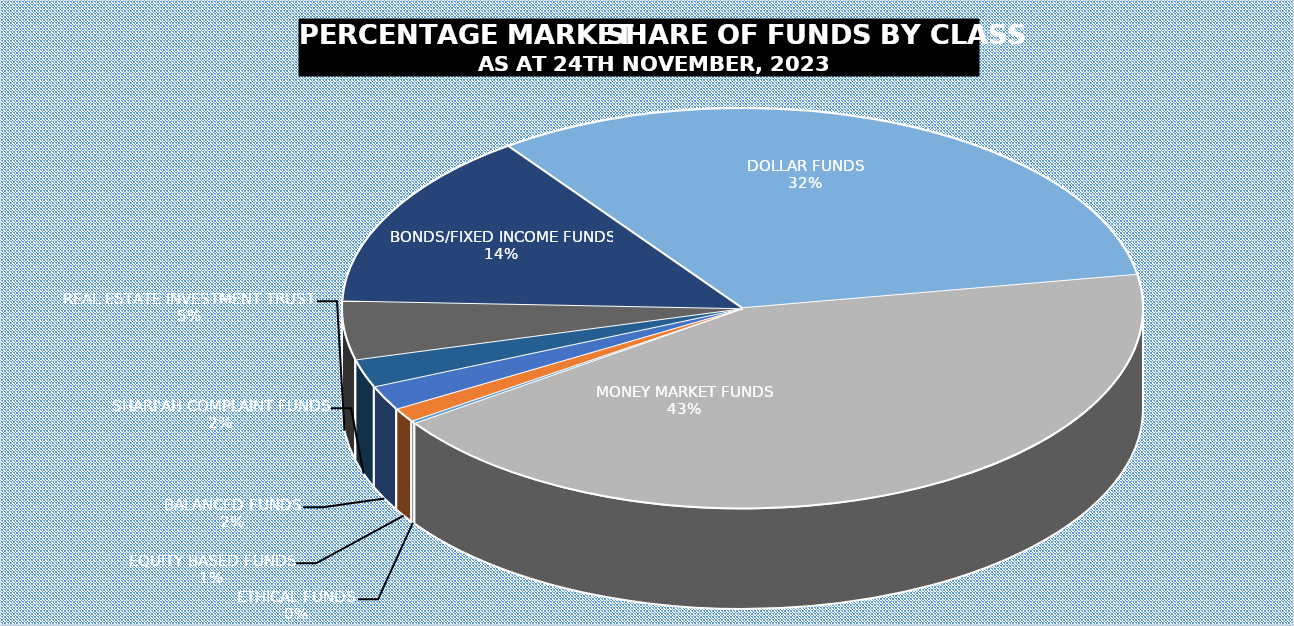
| Category | 24-Nov |
|---|---|
| ETHICAL FUNDS | 4234494815.85 |
| EQUITY BASED FUNDS | 22917888550.565 |
| BALANCED FUNDS | 40186047185.191 |
| SHARI'AH COMPLAINT FUNDS | 45908361267.54 |
| REAL ESTATE INVESTMENT TRUST | 95820553466.403 |
| BONDS/FIXED INCOME FUNDS | 292383213255.361 |
| DOLLAR FUNDS | 652996623374.599 |
| MONEY MARKET FUNDS | 869350685967.342 |